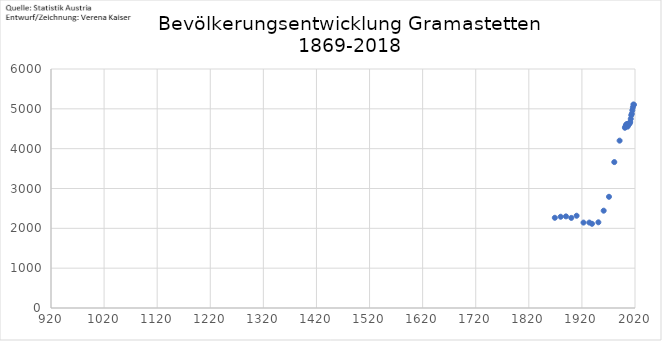
| Category | Anzahl |
|---|---|
| 2018.0 | 5102 |
| 2017.0 | 5108 |
| 2016.0 | 5038 |
| 2015.0 | 4965 |
| 2014.0 | 4877 |
| 2013.0 | 4841 |
| 2012.0 | 4748 |
| 2011.0 | 4670 |
| 2010.0 | 4634 |
| 2009.0 | 4627 |
| 2008.0 | 4613 |
| 2007.0 | 4586 |
| 2006.0 | 4553 |
| 2005.0 | 4617 |
| 2004.0 | 4612 |
| 2003.0 | 4592 |
| 2002.0 | 4553 |
| 2001.0 | 4525 |
| 1991.0 | 4201 |
| 1981.0 | 3663 |
| 1971.0 | 2792 |
| 1961.0 | 2443 |
| 1951.0 | 2151 |
| 1939.0 | 2114 |
| 1934.0 | 2145 |
| 1923.0 | 2144 |
| 1910.0 | 2316 |
| 1900.0 | 2262 |
| 1890.0 | 2300 |
| 1880.0 | 2291 |
| 1869.0 | 2265 |